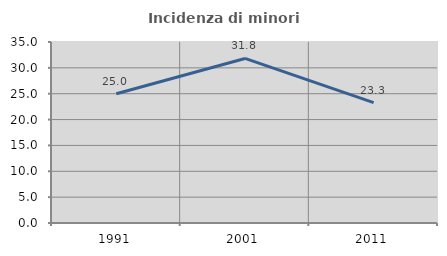
| Category | Incidenza di minori stranieri |
|---|---|
| 1991.0 | 25 |
| 2001.0 | 31.818 |
| 2011.0 | 23.276 |